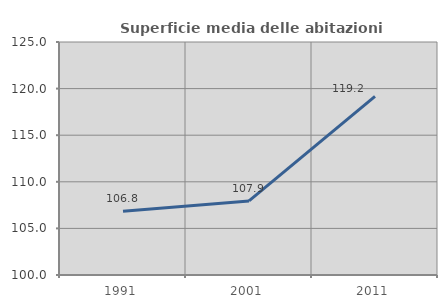
| Category | Superficie media delle abitazioni occupate |
|---|---|
| 1991.0 | 106.831 |
| 2001.0 | 107.945 |
| 2011.0 | 119.168 |